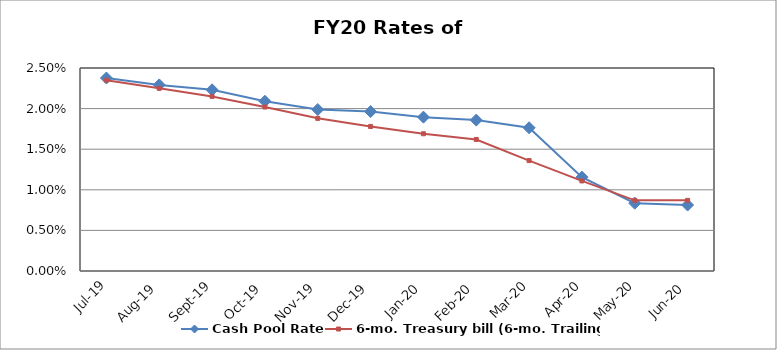
| Category | Cash Pool Rate | 6-mo. Treasury bill (6-mo. Trailing) |
|---|---|---|
| 2019-07-31 | 0.024 | 0.024 |
| 2019-08-31 | 0.023 | 0.022 |
| 2019-09-30 | 0.022 | 0.022 |
| 2019-10-31 | 0.021 | 0.02 |
| 2019-11-30 | 0.02 | 0.019 |
| 2019-12-31 | 0.02 | 0.018 |
| 2020-01-31 | 0.019 | 0.017 |
| 2020-02-29 | 0.019 | 0.016 |
| 2020-03-31 | 0.018 | 0.014 |
| 2020-04-30 | 0.012 | 0.011 |
| 2020-05-31 | 0.008 | 0.009 |
| 2020-06-20 | 0.008 | 0.009 |